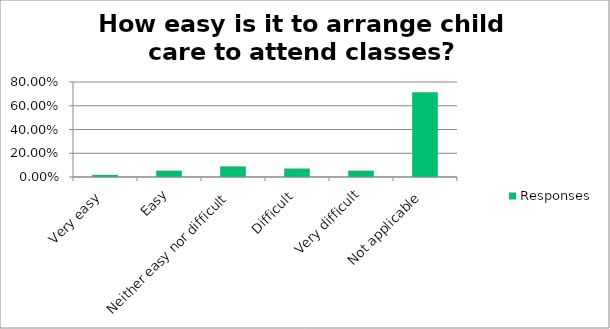
| Category | Responses |
|---|---|
| Very easy | 0.018 |
| Easy | 0.054 |
| Neither easy nor difficult | 0.089 |
| Difficult | 0.071 |
| Very difficult | 0.054 |
| Not applicable | 0.714 |